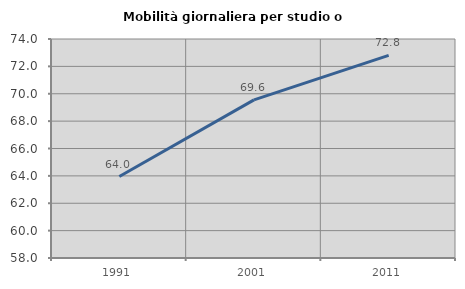
| Category | Mobilità giornaliera per studio o lavoro |
|---|---|
| 1991.0 | 63.952 |
| 2001.0 | 69.554 |
| 2011.0 | 72.8 |